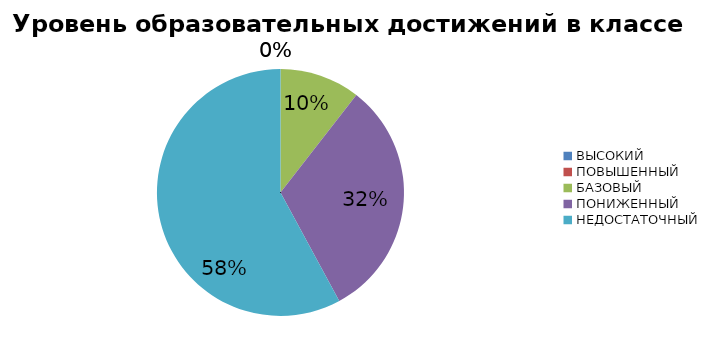
| Category | Series 0 |
|---|---|
| ВЫСОКИЙ | 0 |
| ПОВЫШЕННЫЙ | 0 |
| БАЗОВЫЙ | 6.897 |
| ПОНИЖЕННЫЙ | 20.69 |
| НЕДОСТАТОЧНЫЙ | 37.931 |